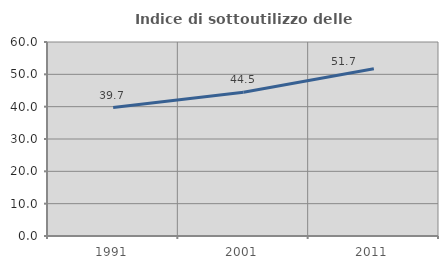
| Category | Indice di sottoutilizzo delle abitazioni  |
|---|---|
| 1991.0 | 39.716 |
| 2001.0 | 44.483 |
| 2011.0 | 51.724 |